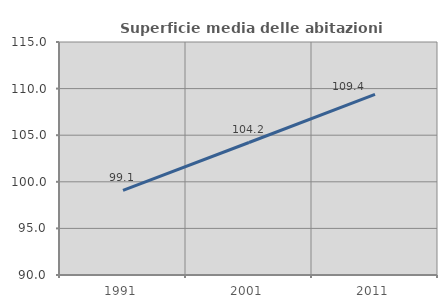
| Category | Superficie media delle abitazioni occupate |
|---|---|
| 1991.0 | 99.089 |
| 2001.0 | 104.218 |
| 2011.0 | 109.384 |